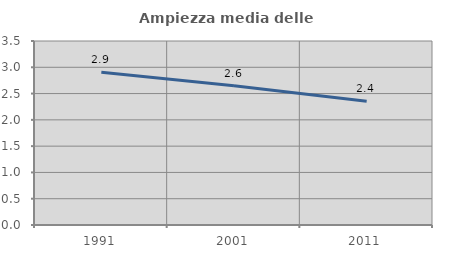
| Category | Ampiezza media delle famiglie |
|---|---|
| 1991.0 | 2.904 |
| 2001.0 | 2.647 |
| 2011.0 | 2.355 |